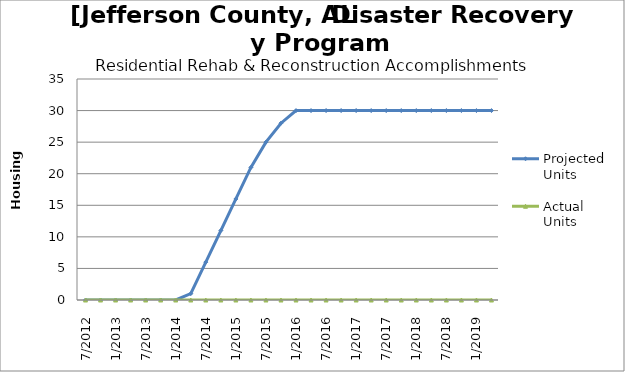
| Category | Projected Units | Actual Units |
|---|---|---|
| 7/2012 | 0 | 0 |
| 10/2012 | 0 | 0 |
| 1/2013 | 0 | 0 |
| 4/2013 | 0 | 0 |
| 7/2013 | 0 | 0 |
| 10/2013 | 0 | 0 |
| 1/2014 | 0 | 0 |
| 4/2014 | 1 | 0 |
| 7/2014 | 6 | 0 |
| 10/2014 | 11 | 0 |
| 1/2015 | 16 | 0 |
| 4/2015 | 21 | 0 |
| 7/2015 | 25 | 0 |
| 10/2015 | 28 | 0 |
| 1/2016 | 30 | 0 |
| 4/2016 | 30 | 0 |
| 7/2016 | 30 | 0 |
| 10/2016 | 30 | 0 |
| 1/2017 | 30 | 0 |
| 4/2017 | 30 | 0 |
| 7/2017 | 30 | 0 |
| 10/2017 | 30 | 0 |
| 1/2018 | 30 | 0 |
| 4/2018 | 30 | 0 |
| 7/2018 | 30 | 0 |
| 10/2018 | 30 | 0 |
| 1/2019 | 30 | 0 |
| 4/2019 | 30 | 0 |